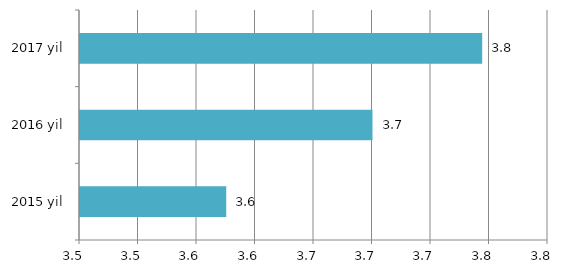
| Category | Series 0 |
|---|---|
| 2015 yil | 3.6 |
| 2016 yil | 3.7 |
| 2017 yil | 3.775 |